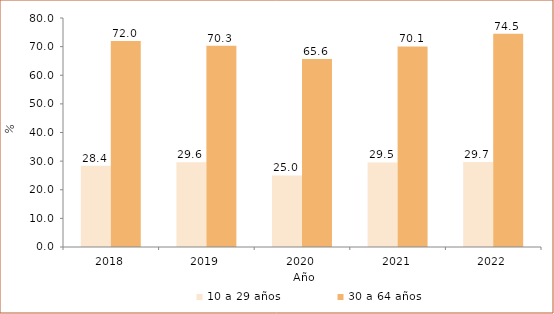
| Category | 10 a 29 años | 30 a 64 años |
|---|---|---|
| 2018.0 | 28.426 | 72.002 |
| 2019.0 | 29.608 | 70.276 |
| 2020.0 | 24.995 | 65.645 |
| 2021.0 | 29.523 | 70.077 |
| 2022.0 | 29.7 | 74.5 |